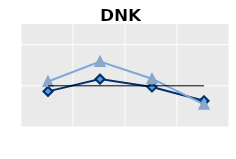
| Category | Né à l'étranger | Né dans le pays | Series 1 |
|---|---|---|---|
| 15-24 | 0.865 | 1.104 | 1 |
| 25-54 | 1.162 | 1.591 | 1 |
| 55-64 | 0.973 | 1.172 | 1 |
| 65+ | 0.635 | 0.551 | 1 |